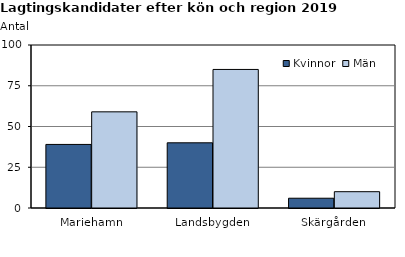
| Category | Kvinnor | Män |
|---|---|---|
| Mariehamn | 39 | 59 |
| Landsbygden | 40 | 85 |
| Skärgården | 6 | 10 |